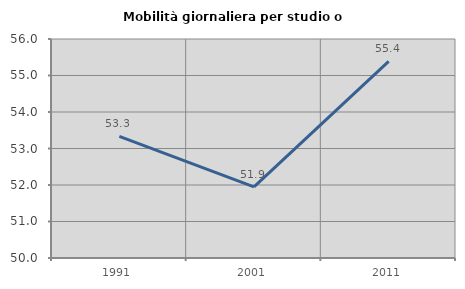
| Category | Mobilità giornaliera per studio o lavoro |
|---|---|
| 1991.0 | 53.333 |
| 2001.0 | 51.948 |
| 2011.0 | 55.385 |